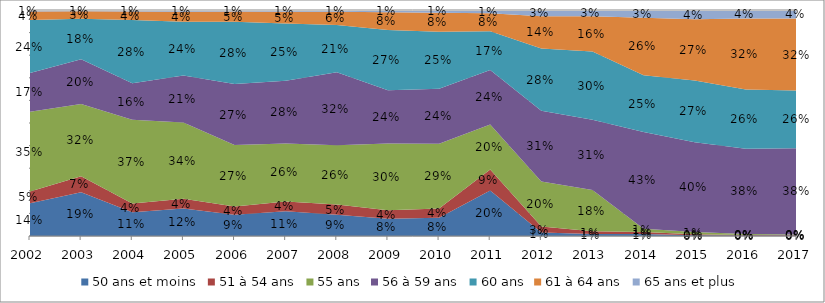
| Category | 50 ans et moins | 51 à 54 ans | 55 ans | 56 à 59 ans | 60 ans | 61 à 64 ans | 65 ans et plus |
|---|---|---|---|---|---|---|---|
| 2002.0 | 0.145 | 0.052 | 0.353 | 0.171 | 0.235 | 0.037 | 0.007 |
| 2003.0 | 0.193 | 0.072 | 0.319 | 0.198 | 0.179 | 0.034 | 0.005 |
| 2004.0 | 0.106 | 0.039 | 0.37 | 0.161 | 0.28 | 0.038 | 0.006 |
| 2005.0 | 0.122 | 0.043 | 0.338 | 0.208 | 0.238 | 0.045 | 0.007 |
| 2006.0 | 0.094 | 0.036 | 0.272 | 0.271 | 0.275 | 0.045 | 0.007 |
| 2007.0 | 0.109 | 0.043 | 0.257 | 0.278 | 0.253 | 0.052 | 0.008 |
| 2008.0 | 0.094 | 0.046 | 0.262 | 0.323 | 0.209 | 0.058 | 0.008 |
| 2009.0 | 0.076 | 0.038 | 0.296 | 0.236 | 0.266 | 0.078 | 0.01 |
| 2010.0 | 0.08 | 0.041 | 0.286 | 0.244 | 0.252 | 0.084 | 0.012 |
| 2011.0 | 0.201 | 0.093 | 0.199 | 0.241 | 0.172 | 0.08 | 0.014 |
| 2012.0 | 0.015 | 0.027 | 0.199 | 0.313 | 0.276 | 0.142 | 0.028 |
| 2013.0 | 0.009 | 0.012 | 0.182 | 0.311 | 0.302 | 0.157 | 0.027 |
| 2014.0 | 0.009 | 0.009 | 0.014 | 0.429 | 0.251 | 0.255 | 0.034 |
| 2015.0 | 0.003 | 0.004 | 0.01 | 0.397 | 0.274 | 0.271 | 0.041 |
| 2016.0 | 0.002 | 0.002 | 0.005 | 0.377 | 0.262 | 0.315 | 0.037 |
| 2017.0 | 0.002 | 0.003 | 0.002 | 0.381 | 0.255 | 0.319 | 0.037 |